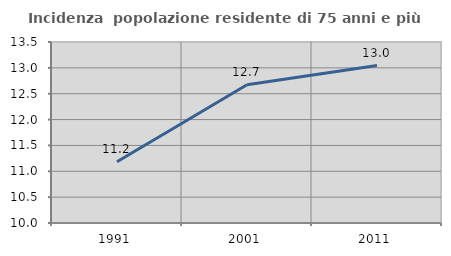
| Category | Incidenza  popolazione residente di 75 anni e più |
|---|---|
| 1991.0 | 11.185 |
| 2001.0 | 12.675 |
| 2011.0 | 13.043 |